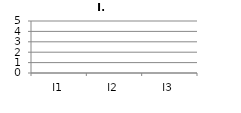
| Category | Gemiddelde |
|---|---|
| I1 | 0 |
| I2 | 0 |
| I3 | 0 |